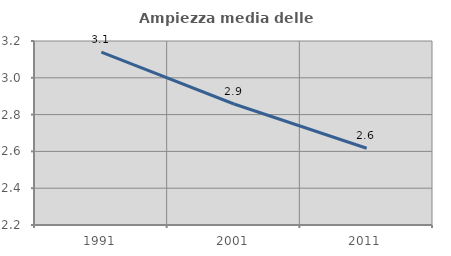
| Category | Ampiezza media delle famiglie |
|---|---|
| 1991.0 | 3.14 |
| 2001.0 | 2.858 |
| 2011.0 | 2.617 |